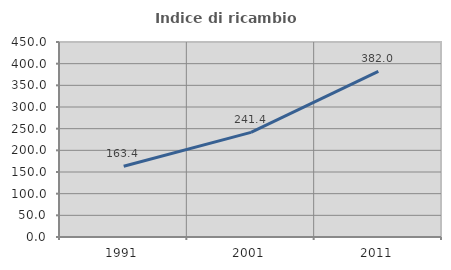
| Category | Indice di ricambio occupazionale  |
|---|---|
| 1991.0 | 163.415 |
| 2001.0 | 241.436 |
| 2011.0 | 382.014 |